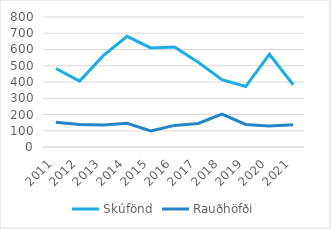
| Category | Skúfönd | Rauðhöfði |
|---|---|---|
| 2011.0 | 483 | 153 |
| 2012.0 | 406 | 139 |
| 2013.0 | 562 | 136 |
| 2014.0 | 681 | 146 |
| 2015.0 | 610 | 99 |
| 2016.0 | 616 | 133 |
| 2017.0 | 522 | 145 |
| 2018.0 | 414 | 202 |
| 2019.0 | 372 | 139 |
| 2020.0 | 571 | 129 |
| 2021.0 | 383 | 137 |